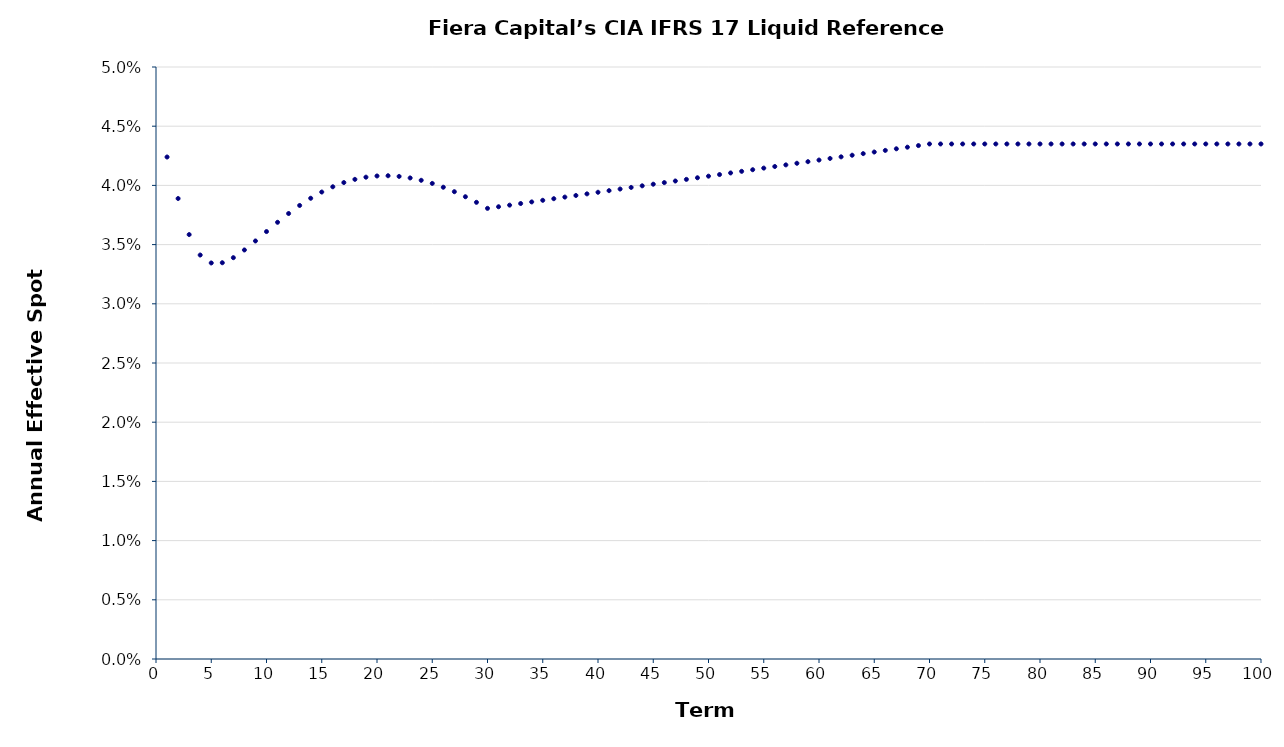
| Category | Annual Effective Spot Rate |
|---|---|
| 1.0 | 0.042 |
| 2.0 | 0.039 |
| 3.0 | 0.036 |
| 4.0 | 0.034 |
| 5.0 | 0.033 |
| 6.0 | 0.033 |
| 7.0 | 0.034 |
| 8.0 | 0.035 |
| 9.0 | 0.035 |
| 10.0 | 0.036 |
| 11.0 | 0.037 |
| 12.0 | 0.038 |
| 13.0 | 0.038 |
| 14.0 | 0.039 |
| 15.0 | 0.039 |
| 16.0 | 0.04 |
| 17.0 | 0.04 |
| 18.0 | 0.041 |
| 19.0 | 0.041 |
| 20.0 | 0.041 |
| 21.0 | 0.041 |
| 22.0 | 0.041 |
| 23.0 | 0.041 |
| 24.0 | 0.04 |
| 25.0 | 0.04 |
| 26.0 | 0.04 |
| 27.0 | 0.039 |
| 28.0 | 0.039 |
| 29.0 | 0.039 |
| 30.0 | 0.038 |
| 31.0 | 0.038 |
| 32.0 | 0.038 |
| 33.0 | 0.038 |
| 34.0 | 0.039 |
| 35.0 | 0.039 |
| 36.0 | 0.039 |
| 37.0 | 0.039 |
| 38.0 | 0.039 |
| 39.0 | 0.039 |
| 40.0 | 0.039 |
| 41.0 | 0.04 |
| 42.0 | 0.04 |
| 43.0 | 0.04 |
| 44.0 | 0.04 |
| 45.0 | 0.04 |
| 46.0 | 0.04 |
| 47.0 | 0.04 |
| 48.0 | 0.041 |
| 49.0 | 0.041 |
| 50.0 | 0.041 |
| 51.0 | 0.041 |
| 52.0 | 0.041 |
| 53.0 | 0.041 |
| 54.0 | 0.041 |
| 55.0 | 0.041 |
| 56.0 | 0.042 |
| 57.0 | 0.042 |
| 58.0 | 0.042 |
| 59.0 | 0.042 |
| 60.0 | 0.042 |
| 61.0 | 0.042 |
| 62.0 | 0.042 |
| 63.0 | 0.043 |
| 64.0 | 0.043 |
| 65.0 | 0.043 |
| 66.0 | 0.043 |
| 67.0 | 0.043 |
| 68.0 | 0.043 |
| 69.0 | 0.043 |
| 70.0 | 0.044 |
| 71.0 | 0.044 |
| 72.0 | 0.044 |
| 73.0 | 0.044 |
| 74.0 | 0.044 |
| 75.0 | 0.044 |
| 76.0 | 0.044 |
| 77.0 | 0.044 |
| 78.0 | 0.044 |
| 79.0 | 0.044 |
| 80.0 | 0.044 |
| 81.0 | 0.044 |
| 82.0 | 0.044 |
| 83.0 | 0.044 |
| 84.0 | 0.044 |
| 85.0 | 0.044 |
| 86.0 | 0.044 |
| 87.0 | 0.044 |
| 88.0 | 0.044 |
| 89.0 | 0.044 |
| 90.0 | 0.044 |
| 91.0 | 0.044 |
| 92.0 | 0.044 |
| 93.0 | 0.044 |
| 94.0 | 0.044 |
| 95.0 | 0.044 |
| 96.0 | 0.044 |
| 97.0 | 0.044 |
| 98.0 | 0.044 |
| 99.0 | 0.044 |
| 100.0 | 0.044 |